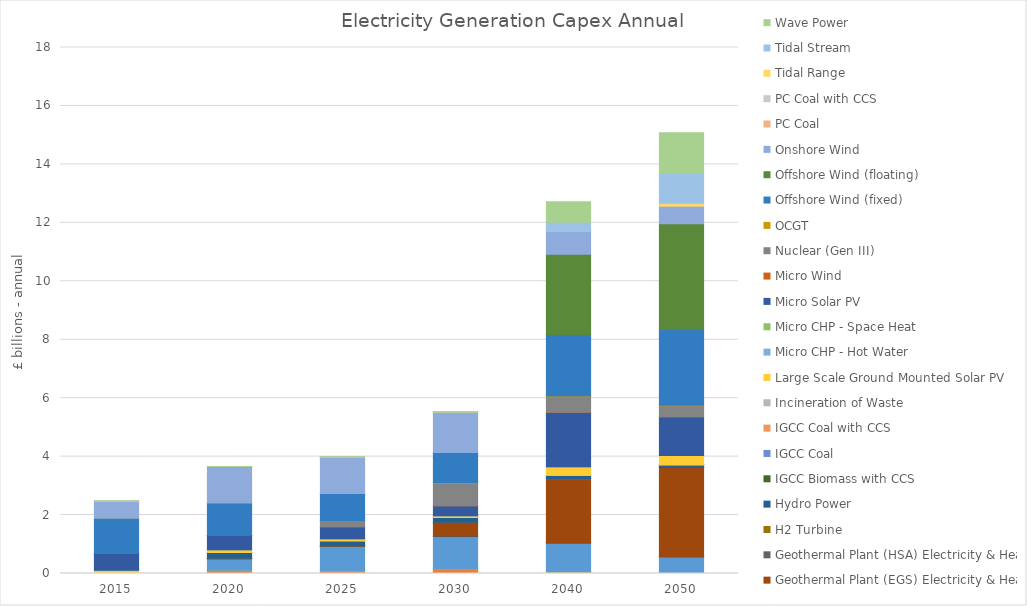
| Category | Anaerobic Digestion CHP Plant | Biomass Fired Generation | Biomass Macro CHP | CCGT | CCGT with CCS | Gas Macro CHP | Geothermal Plant (EGS) Electricity & Heat | Geothermal Plant (HSA) Electricity & Heat | H2 Turbine | Hydro Power | IGCC Biomass with CCS | IGCC Coal | IGCC Coal with CCS | Incineration of Waste | Large Scale Ground Mounted Solar PV | Micro CHP - Hot Water | Micro CHP - Space Heat | Micro Solar PV | Micro Wind | Nuclear (Gen III) | OCGT | Offshore Wind (fixed) | Offshore Wind (floating) | Onshore Wind | PC Coal | PC Coal with CCS | Tidal Range | Tidal Stream | Wave Power |
|---|---|---|---|---|---|---|---|---|---|---|---|---|---|---|---|---|---|---|---|---|---|---|---|---|---|---|---|---|---|
| 2015.0 | 0 | 0 | 0 | 0 | 0 | 0 | 0 | 0 | 0 | 0 | 0 | 0 | 0 | 0 | 0.107 | 0 | 0 | 0.577 | 0 | 0 | 0 | 1.209 | 0 | 0.588 | 0 | 0 | 0 | 0 | 0 |
| 2020.0 | 0.112 | 0 | 0 | 0.39 | 0 | 0.003 | 0.017 | 0 | 0 | 0.202 | 0 | 0 | 0 | 0 | 0.09 | 0 | 0 | 0.486 | 0 | 0 | 0 | 1.11 | 0 | 1.249 | 0 | 0 | 0 | 0 | 0 |
| 2025.0 | 0.094 | 0 | 0 | 0.836 | 0 | 0.002 | 0.014 | 0 | 0 | 0.17 | 0 | 0 | 0 | 0 | 0.076 | 0 | 0 | 0.409 | 0 | 0.201 | 0 | 0.935 | 0 | 1.247 | 0 | 0 | 0 | 0 | 0 |
| 2030.0 | 0.155 | 0 | 0 | 1.123 | 0 | 0.002 | 0.476 | 0 | 0 | 0.158 | 0 | 0 | 0 | 0 | 0.064 | 0 | 0 | 0.345 | 0 | 0.757 | 0.027 | 1.037 | 0 | 1.383 | 0 | 0 | 0 | 0 | 0 |
| 2040.0 | 0.054 | 0 | 0 | 0.993 | 0 | 0.001 | 2.19 | 0 | 0 | 0.122 | 0 | 0 | 0 | 0 | 0.293 | 0 | 0 | 1.862 | 0 | 0.537 | 0.019 | 2.111 | 2.744 | 0.8 | 0 | 0 | 0 | 0.292 | 0.704 |
| 2050.0 | 0 | 0 | 0 | 0.574 | 0 | 0 | 3.053 | 0 | 0 | 0.094 | 0 | 0 | 0 | 0 | 0.32 | 0 | 0 | 1.32 | 0 | 0.381 | 0.014 | 2.595 | 3.615 | 0.612 | 0 | 0 | 0.095 | 1.014 | 1.395 |